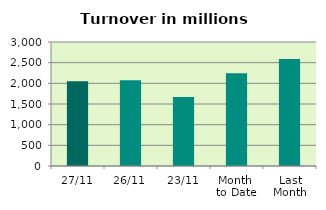
| Category | Series 0 |
|---|---|
| 27/11 | 2051.233 |
| 26/11 | 2077.305 |
| 23/11 | 1670.003 |
| Month 
to Date | 2246.48 |
| Last
Month | 2586.958 |